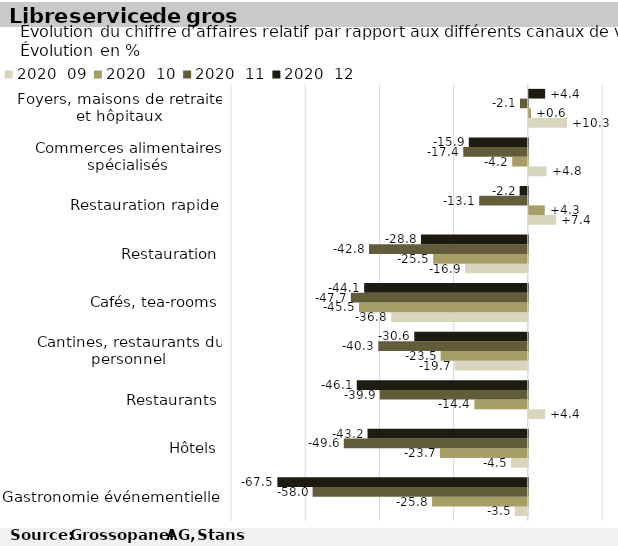
| Category | 2020  |
|---|---|
| Gastronomie événementielle | -67.5 |
| Hôtels | -43.2 |
| Restaurants | -46.1 |
| Cantines, restaurants du personnel | -30.6 |
| Cafés, tea-rooms | -44.1 |
| Restauration | -28.8 |
| Restauration rapide | -2.2 |
| Commerces alimentaires spécialisés | -15.9 |
| Foyers, maisons de retraite et hôpitaux | 4.4 |